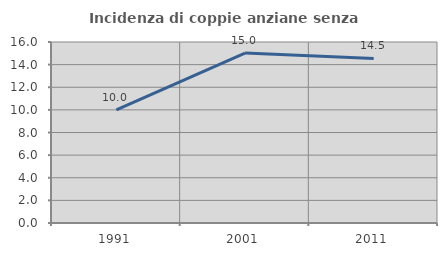
| Category | Incidenza di coppie anziane senza figli  |
|---|---|
| 1991.0 | 10 |
| 2001.0 | 15.021 |
| 2011.0 | 14.543 |